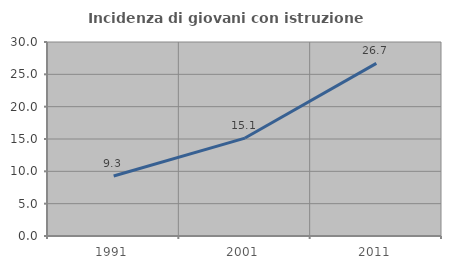
| Category | Incidenza di giovani con istruzione universitaria |
|---|---|
| 1991.0 | 9.272 |
| 2001.0 | 15.144 |
| 2011.0 | 26.694 |